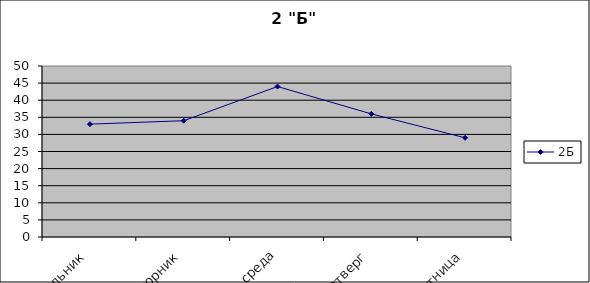
| Category | 2Б |
|---|---|
| понедельник | 33 |
| вторник | 34 |
| среда | 44 |
| четверг | 36 |
| пятница | 29 |